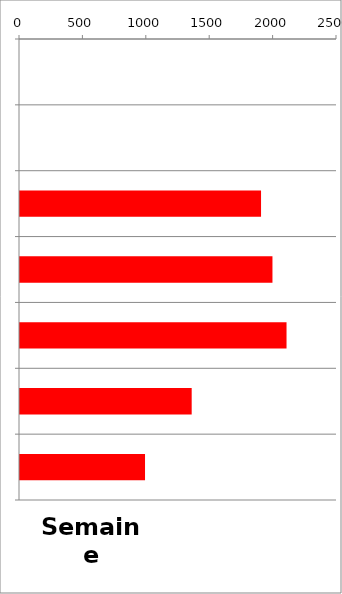
| Category | TV |
|---|---|
| 0 | 0 |
| 1 | 0 |
| 2 | 1901 |
| 3 | 1991 |
| 4 | 2102 |
| 5 | 1354 |
| 6 | 986 |